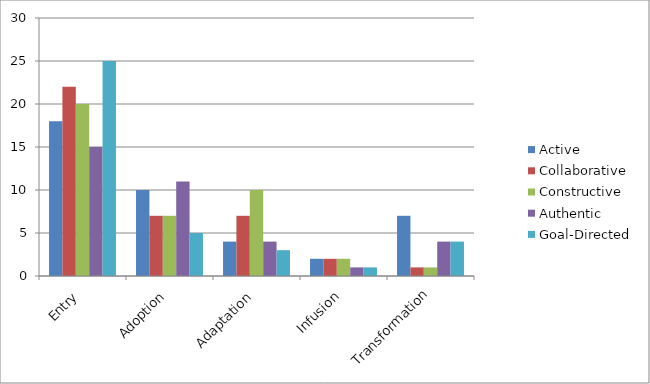
| Category | Active | Collaborative | Constructive | Authentic | Goal-Directed |
|---|---|---|---|---|---|
| Entry | 18 | 22 | 20 | 15 | 25 |
| Adoption | 10 | 7 | 7 | 11 | 5 |
| Adaptation | 4 | 7 | 10 | 4 | 3 |
| Infusion | 2 | 2 | 2 | 1 | 1 |
| Transformation | 7 | 1 | 1 | 4 | 4 |